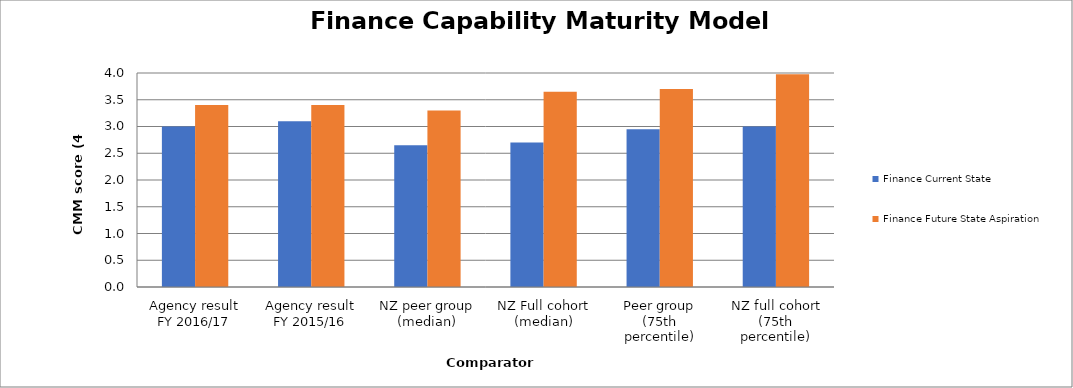
| Category | Finance Current State | Finance Future State Aspiration |
|---|---|---|
| Agency result
FY 2016/17 | 3 | 3.4 |
| Agency result
FY 2015/16 | 3.1 | 3.4 |
| NZ peer group (median) | 2.65 | 3.3 |
| NZ Full cohort (median) | 2.7 | 3.65 |
| Peer group (75th percentile) | 2.95 | 3.7 |
| NZ full cohort (75th percentile) | 3 | 3.975 |